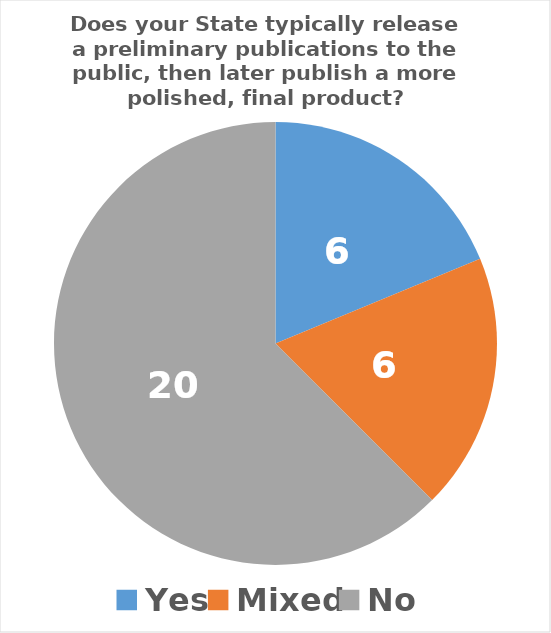
| Category | Series 0 |
|---|---|
| Yes | 6 |
| Mixed | 6 |
| No | 20 |